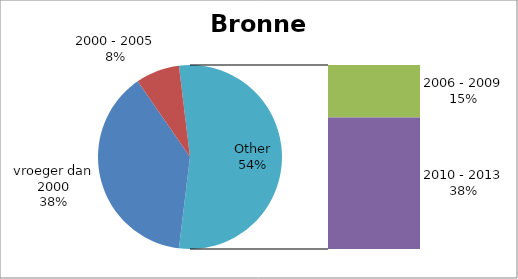
| Category | Procenten |
|---|---|
| vroeger dan 2000 | 38.462 |
| 2000 - 2005 | 7.692 |
| 2006 - 2009 | 15.385 |
| 2010 - 2013 | 38.462 |